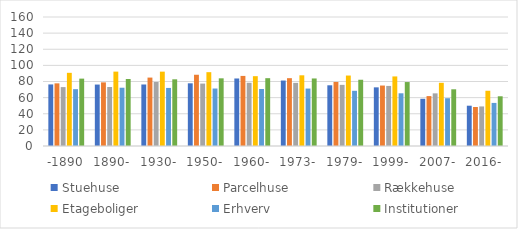
| Category | Stuehuse | Parcelhuse | Rækkehuse | Etageboliger | Erhverv | Institutioner |
|---|---|---|---|---|---|---|
| -1890 | 76.363 | 77.705 | 73.051 | 90.76 | 70.493 | 83.567 |
| 1890- | 76.202 | 78.913 | 73.185 | 92.257 | 72.28 | 83.079 |
| 1930- | 76.291 | 84.86 | 79.386 | 92.225 | 72.016 | 82.718 |
| 1950- | 77.744 | 88.373 | 77.427 | 91.572 | 71.289 | 83.938 |
| 1960- | 83.743 | 86.927 | 78.43 | 86.608 | 70.736 | 84.115 |
| 1973- | 81.195 | 84.12 | 78.281 | 87.684 | 71.247 | 83.768 |
| 1979- | 75.296 | 79.437 | 75.82 | 87.393 | 68.457 | 82.175 |
| 1999- | 72.745 | 74.992 | 74.515 | 86.292 | 65.374 | 79.321 |
| 2007- | 58.56 | 61.904 | 65.296 | 78.386 | 59.254 | 70.341 |
| 2016- | 49.981 | 48.362 | 49.069 | 68.518 | 53.437 | 61.682 |